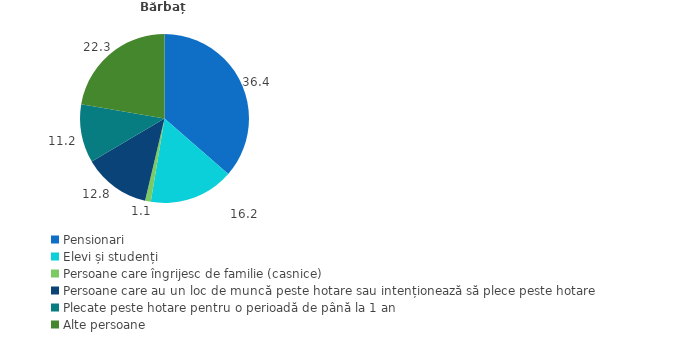
| Category | Bărbați |
|---|---|
| Pensionari | 36.4 |
| Elevi și studenți | 16.2 |
| Persoane care îngrijesc de familie (casnice) | 1.1 |
| Persoane care au un loc de muncă peste hotare sau intenționează să plece peste hotare | 12.8 |
| Plecate peste hotare pentru o perioadă de până la 1 an | 11.2 |
| Alte persoane | 22.3 |